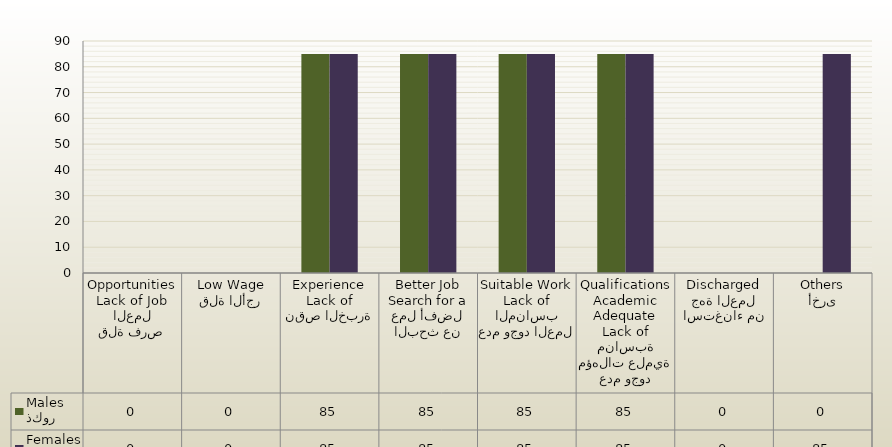
| Category | ذكور
Males | اناث
Females |
|---|---|---|
| قلة فرص العمل
Lack of Job Opportunities | 0 | 0 |
| قلة الأجر
Low Wage | 0 | 0 |
| نقص الخبرة
Lack of Experience | 85 | 85 |
| البحث عن عمل أفضل
Search for a Better Job | 85 | 85 |
| عدم وجود العمل المناسب
Lack of Suitable Work | 85 | 85 |
| عدم وجود مؤهلات علمية مناسبة
Lack of Adequate Academic Qualifications | 85 | 85 |
| استغناء من جهة العمل
Discharged | 0 | 0 |
| أخرى
Others | 0 | 85 |